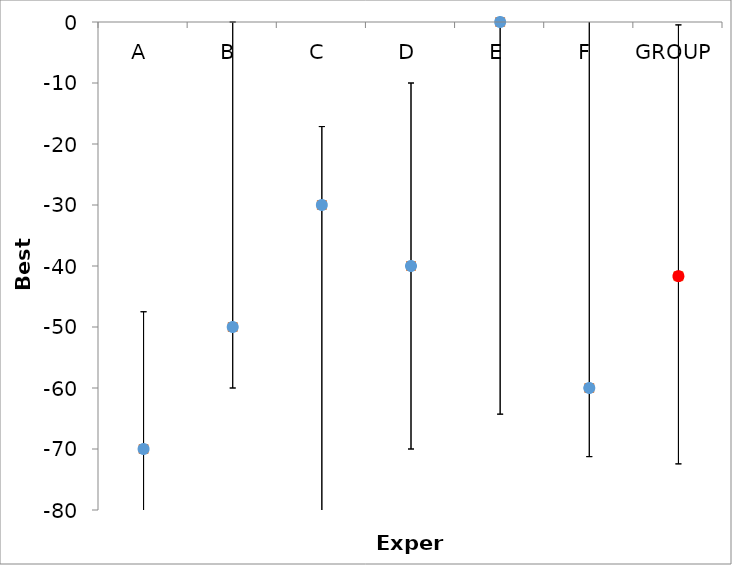
| Category | Series 1 | Series 0 |
|---|---|---|
| A | -70 | -70 |
| B | -50 | -50 |
| C | -30 | -30 |
| D | -40 | -40 |
| E | 0 | 0 |
| F | -60 | -60 |
| GROUP | -41.667 | -41.667 |